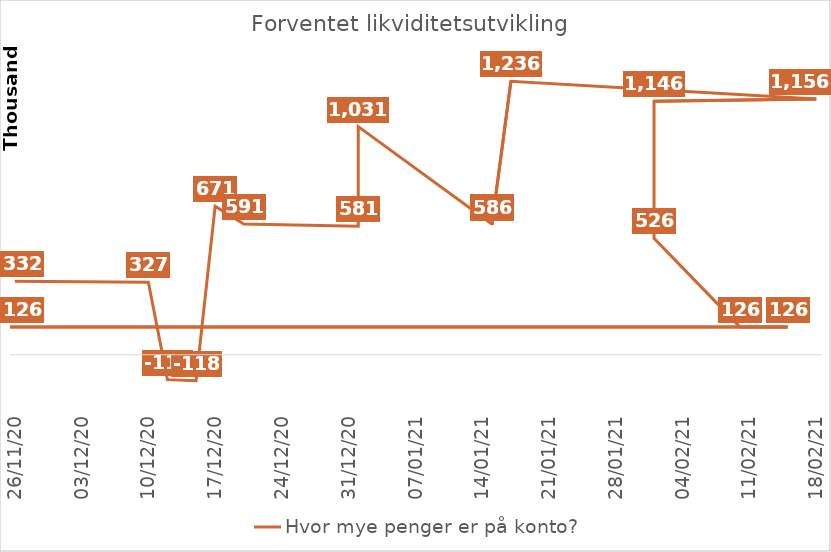
| Category | Hvor mye penger er på konto? |
|---|---|
| 26.11.20 | 332416 |
| 10.12.20 | 327416 |
| 12.12.20 | -112584 |
| 15.12.20 | -117584 |
| 17.12.20 | 670916 |
| 20.12.20 | 590916 |
| 01.01.21 | 580916 |
| 01.01.21 | 1030916 |
| 15.01.21 | 590916 |
| 15.01.21 | 585916 |
| 17.01.21 | 1235916 |
| 18.02.21 | 1155916 |
| 01.02.21 | 1145916 |
| 01.02.21 | 525916 |
| 10.02.21 | 125916 |
| 15.02.21 | 125916 |